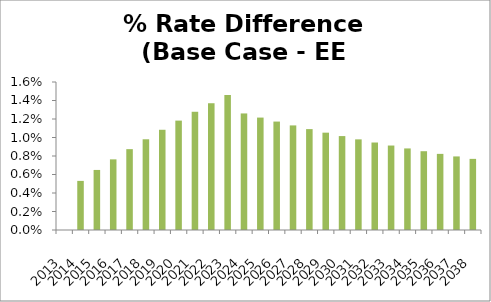
| Category | Series 0 |
|---|---|
| 2013.0 | 0 |
| 2014.0 | 0.005 |
| 2015.0 | 0.006 |
| 2016.0 | 0.008 |
| 2017.0 | 0.009 |
| 2018.0 | 0.01 |
| 2019.0 | 0.011 |
| 2020.0 | 0.012 |
| 2021.0 | 0.013 |
| 2022.0 | 0.014 |
| 2023.0 | 0.015 |
| 2024.0 | 0.013 |
| 2025.0 | 0.012 |
| 2026.0 | 0.012 |
| 2027.0 | 0.011 |
| 2028.0 | 0.011 |
| 2029.0 | 0.011 |
| 2030.0 | 0.01 |
| 2031.0 | 0.01 |
| 2032.0 | 0.009 |
| 2033.0 | 0.009 |
| 2034.0 | 0.009 |
| 2035.0 | 0.009 |
| 2036.0 | 0.008 |
| 2037.0 | 0.008 |
| 2038.0 | 0.008 |